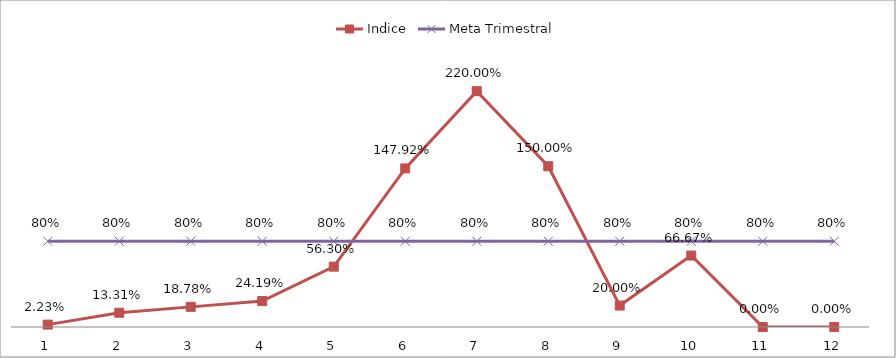
| Category | Indice | Meta Trimestral |
|---|---|---|
| 0 | 0.022 | 0.8 |
| 1 | 0.133 | 0.8 |
| 2 | 0.188 | 0.8 |
| 3 | 0.242 | 0.8 |
| 4 | 0.563 | 0.8 |
| 5 | 1.479 | 0.8 |
| 6 | 2.2 | 0.8 |
| 7 | 1.5 | 0.8 |
| 8 | 0.2 | 0.8 |
| 9 | 0.667 | 0.8 |
| 10 | 0 | 0.8 |
| 11 | 0 | 0.8 |